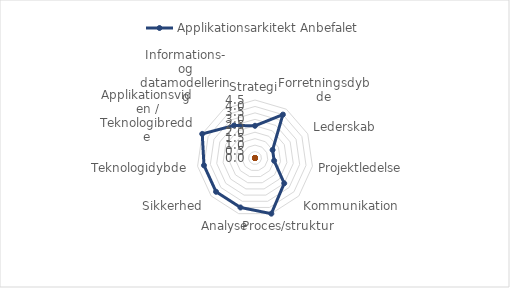
| Category | Applikationsarkitekt |
|---|---|
| Strategi |  |
| Forretningsdybde |  |
| Lederskab |  |
| Projektledelse |  |
| Kommunikation |  |
| Proces/struktur |  |
| Analyse |  |
| Sikkerhed |  |
| Teknologidybde |  |
| Applikationsviden / Teknologibredde |  |
| Informations- og datamodellering |  |